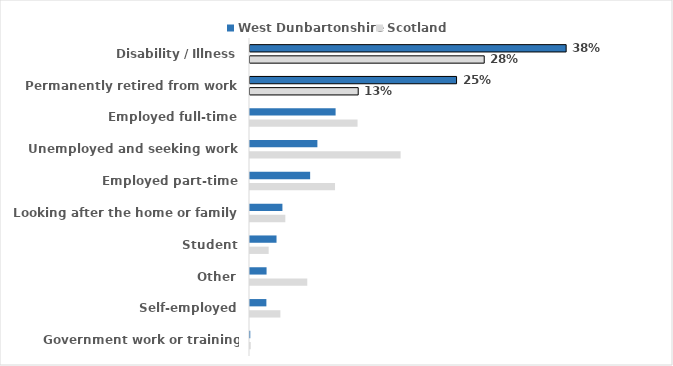
| Category | West Dunbartonshire | Scotland |
|---|---|---|
| Disability / Illness | 0.382 | 0.283 |
| Permanently retired from work | 0.249 | 0.131 |
| Employed full-time | 0.103 | 0.13 |
| Unemployed and seeking work | 0.081 | 0.182 |
| Employed part-time | 0.073 | 0.103 |
| Looking after the home or family | 0.039 | 0.043 |
| Student | 0.032 | 0.023 |
| Other | 0.02 | 0.069 |
| Self-employed | 0.02 | 0.037 |
| Government work or training scheme | 0 | 0.001 |